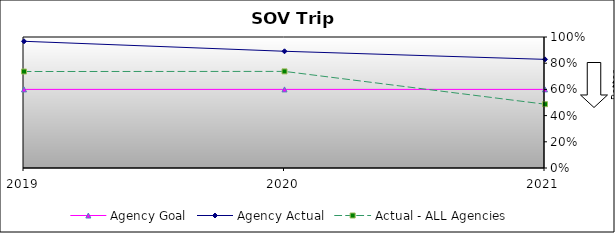
| Category | Agency Goal | Agency Actual | Actual - ALL Agencies |
|---|---|---|---|
| 2019.0 | 0.6 | 0.967 | 0.736 |
| 2020.0 | 0.6 | 0.891 | 0.737 |
| 2021.0 | 0.6 | 0.829 | 0.487 |